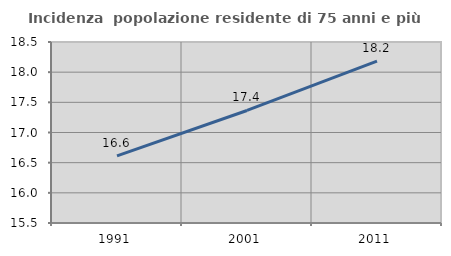
| Category | Incidenza  popolazione residente di 75 anni e più |
|---|---|
| 1991.0 | 16.612 |
| 2001.0 | 17.365 |
| 2011.0 | 18.182 |